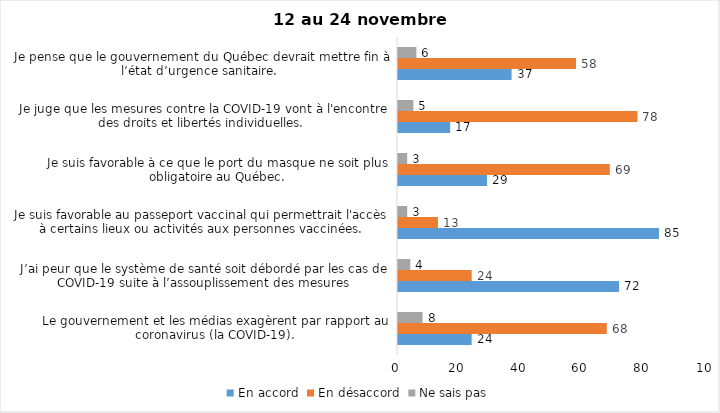
| Category | En accord | En désaccord | Ne sais pas |
|---|---|---|---|
| Le gouvernement et les médias exagèrent par rapport au coronavirus (la COVID-19). | 24 | 68 | 8 |
| J’ai peur que le système de santé soit débordé par les cas de COVID-19 suite à l’assouplissement des mesures | 72 | 24 | 4 |
| Je suis favorable au passeport vaccinal qui permettrait l'accès à certains lieux ou activités aux personnes vaccinées. | 85 | 13 | 3 |
| Je suis favorable à ce que le port du masque ne soit plus obligatoire au Québec. | 29 | 69 | 3 |
| Je juge que les mesures contre la COVID-19 vont à l'encontre des droits et libertés individuelles.  | 17 | 78 | 5 |
| Je pense que le gouvernement du Québec devrait mettre fin à l’état d’urgence sanitaire.  | 37 | 58 | 6 |